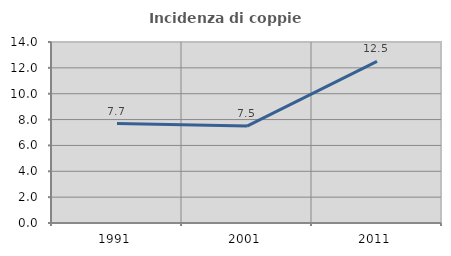
| Category | Incidenza di coppie miste |
|---|---|
| 1991.0 | 7.692 |
| 2001.0 | 7.5 |
| 2011.0 | 12.5 |